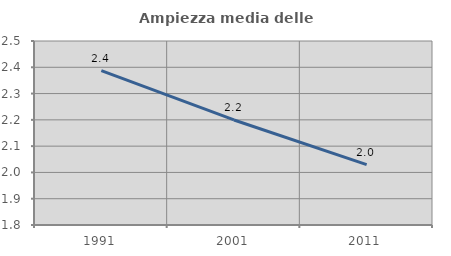
| Category | Ampiezza media delle famiglie |
|---|---|
| 1991.0 | 2.388 |
| 2001.0 | 2.2 |
| 2011.0 | 2.03 |